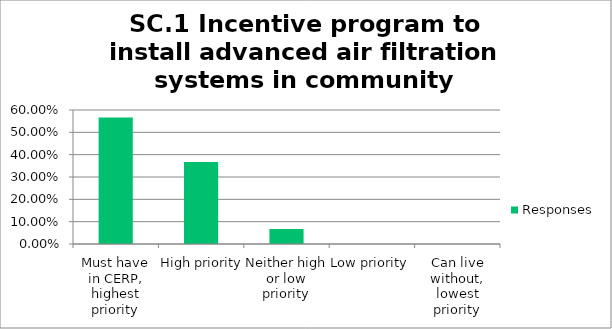
| Category | Responses |
|---|---|
| Must have in CERP, highest priority | 0.567 |
| High priority | 0.367 |
| Neither high or low priority | 0.067 |
| Low priority | 0 |
| Can live without, lowest priority | 0 |